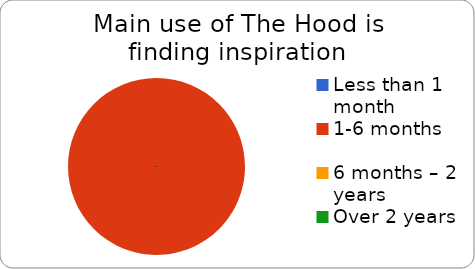
| Category | To find inspiration |
|---|---|
| Less than 1 month | 0 |
| 1-6 months | 1 |
| 6 months – 2 years | 0 |
| Over 2 years | 0 |